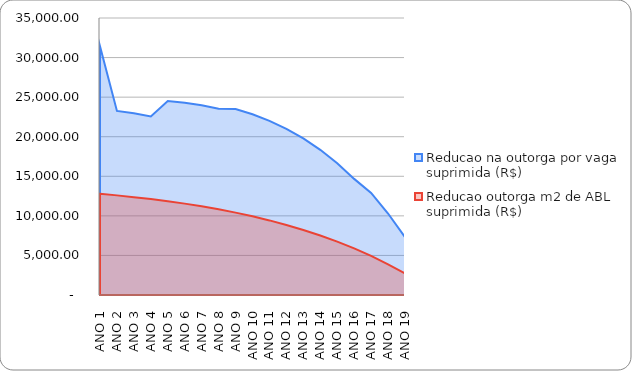
| Category | Reducao na outorga por vaga suprimida (R$) | Reducao outorga m2 de ABL suprimida (R$) |
|---|---|---|
| ANO 1 | 31429.227 | 12786.482 |
| ANO 2 | 23261.113 | 12587.776 |
| ANO 3 | 22971.588 | 12365.512 |
| ANO 4 | 22570.776 | 12119.487 |
| ANO 5 | 24508.766 | 11847.163 |
| ANO 6 | 24297.214 | 11545.727 |
| ANO 7 | 23980.295 | 11212.068 |
| ANO 8 | 23544.676 | 10830.956 |
| ANO 9 | 23493.524 | 10409.104 |
| ANO 10 | 22829.813 | 9942.155 |
| ANO 11 | 22003.808 | 9425.29 |
| ANO 12 | 20995.877 | 8853.172 |
| ANO 13 | 19784.231 | 8219.895 |
| ANO 14 | 18344.693 | 7518.92 |
| ANO 15 | 16650.444 | 6743.01 |
| ANO 16 | 14671.733 | 5884.157 |
| ANO 17 | 12893.543 | 4933.491 |
| ANO 18 | 10298.712 | 3881.2 |
| ANO 19 | 7315.2 | 2716.419 |